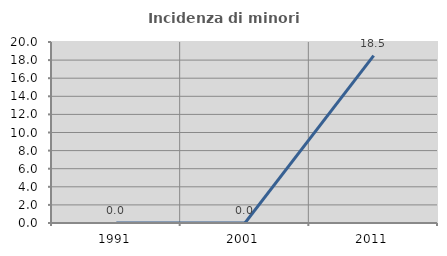
| Category | Incidenza di minori stranieri |
|---|---|
| 1991.0 | 0 |
| 2001.0 | 0 |
| 2011.0 | 18.5 |